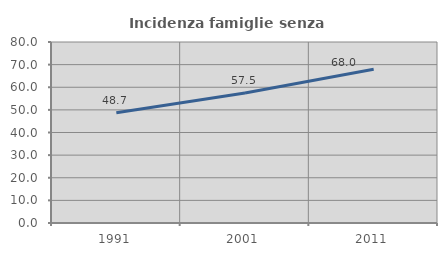
| Category | Incidenza famiglie senza nuclei |
|---|---|
| 1991.0 | 48.696 |
| 2001.0 | 57.5 |
| 2011.0 | 67.961 |